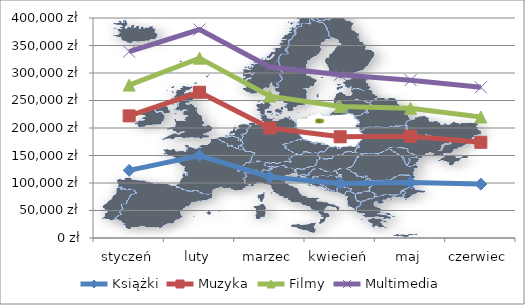
| Category | Książki | Muzyka | Filmy | Multimedia |
|---|---|---|---|---|
| styczeń | 123000 | 99000 | 56000 | 61000 |
| luty | 150000 | 115000 | 62000 | 52000 |
| marzec | 111000 | 89000 | 58000 | 53000 |
| kwiecień | 99000 | 85000 | 55000 | 58000 |
| maj | 101000 | 84000 | 51000 | 51000 |
| czerwiec | 98000 | 76000 | 46000 | 54000 |